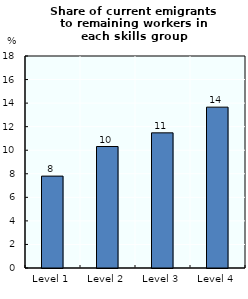
| Category | Series 0 |
|---|---|
| Level 1 | 7.801 |
| Level 2 | 10.315 |
| Level 3 | 11.475 |
| Level 4 | 13.657 |